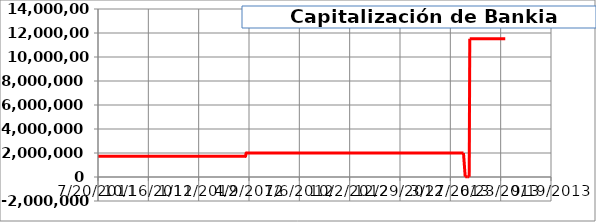
| Category | E:BKIA(UP) |
|---|---|
| 41456.0 | 11517330 |
| 41453.0 | 11517330 |
| 41452.0 | 11517330 |
| 41451.0 | 11517330 |
| 41450.0 | 11517330 |
| 41449.0 | 11517330 |
| 41446.0 | 11517330 |
| 41445.0 | 11517330 |
| 41444.0 | 11517330 |
| 41443.0 | 11517330 |
| 41442.0 | 11517330 |
| 41439.0 | 11517330 |
| 41438.0 | 11517330 |
| 41437.0 | 11517330 |
| 41436.0 | 11517330 |
| 41435.0 | 11517330 |
| 41432.0 | 11517330 |
| 41431.0 | 11517330 |
| 41430.0 | 11517330 |
| 41429.0 | 11517330 |
| 41428.0 | 11517330 |
| 41425.0 | 11517330 |
| 41424.0 | 11517330 |
| 41423.0 | 11517330 |
| 41422.0 | 11517330 |
| 41421.0 | 11517330 |
| 41418.0 | 11517330 |
| 41417.0 | 11517330 |
| 41416.0 | 11517330 |
| 41415.0 | 11517330 |
| 41414.0 | 11517330 |
| 41411.0 | 11517330 |
| 41410.0 | 11517330 |
| 41409.0 | 11517330 |
| 41408.0 | 11517330 |
| 41407.0 | 11517330 |
| 41404.0 | 11517330 |
| 41403.0 | 11517330 |
| 41402.0 | 11517330 |
| 41401.0 | 11517330 |
| 41400.0 | 11517330 |
| 41397.0 | 11517330 |
| 41396.0 | 11517330 |
| 41395.0 | 11517330 |
| 41394.0 | 11517330 |
| 41393.0 | 19940 |
| 41390.0 | 19940 |
| 41389.0 | 19940 |
| 41388.0 | 19940 |
| 41387.0 | 19940 |
| 41386.0 | 19940 |
| 41383.0 | 1993961 |
| 41382.0 | 1993961 |
| 41381.0 | 1993961 |
| 41380.0 | 1993961 |
| 41379.0 | 1993961 |
| 41376.0 | 1993961 |
| 41375.0 | 1993961 |
| 41374.0 | 1993961 |
| 41373.0 | 1993961 |
| 41372.0 | 1993961 |
| 41369.0 | 1993961 |
| 41368.0 | 1993961 |
| 41367.0 | 1993961 |
| 41366.0 | 1993961 |
| 41365.0 | 1993961 |
| 41362.0 | 1993961 |
| 41361.0 | 1993961 |
| 41360.0 | 1993961 |
| 41359.0 | 1993961 |
| 41358.0 | 1993961 |
| 41355.0 | 1993961 |
| 41354.0 | 1993961 |
| 41353.0 | 1993961 |
| 41352.0 | 1993961 |
| 41351.0 | 1993961 |
| 41348.0 | 1993961 |
| 41347.0 | 1993961 |
| 41346.0 | 1993961 |
| 41345.0 | 1993961 |
| 41344.0 | 1993961 |
| 41341.0 | 1993961 |
| 41340.0 | 1993961 |
| 41339.0 | 1993961 |
| 41338.0 | 1993961 |
| 41337.0 | 1993961 |
| 41334.0 | 1993961 |
| 41333.0 | 1993961 |
| 41332.0 | 1993961 |
| 41331.0 | 1993961 |
| 41330.0 | 1993961 |
| 41327.0 | 1993961 |
| 41326.0 | 1993961 |
| 41325.0 | 1993961 |
| 41324.0 | 1993961 |
| 41323.0 | 1993961 |
| 41320.0 | 1993961 |
| 41319.0 | 1993961 |
| 41318.0 | 1993961 |
| 41317.0 | 1993961 |
| 41316.0 | 1993961 |
| 41313.0 | 1993961 |
| 41312.0 | 1993961 |
| 41311.0 | 1993961 |
| 41310.0 | 1993961 |
| 41309.0 | 1993961 |
| 41306.0 | 1993961 |
| 41305.0 | 1993961 |
| 41304.0 | 1993961 |
| 41303.0 | 1993961 |
| 41302.0 | 1993961 |
| 41299.0 | 1993961 |
| 41298.0 | 1993961 |
| 41297.0 | 1993961 |
| 41296.0 | 1993961 |
| 41295.0 | 1993961 |
| 41292.0 | 1993961 |
| 41291.0 | 1993961 |
| 41290.0 | 1993961 |
| 41289.0 | 1993961 |
| 41288.0 | 1993961 |
| 41285.0 | 1993961 |
| 41284.0 | 1993961 |
| 41283.0 | 1993961 |
| 41282.0 | 1993961 |
| 41281.0 | 1993961 |
| 41278.0 | 1993961 |
| 41277.0 | 1993961 |
| 41276.0 | 1993961 |
| 41275.0 | 1993961 |
| 41274.0 | 1993961 |
| 41271.0 | 1993961 |
| 41270.0 | 1993961 |
| 41269.0 | 1993961 |
| 41268.0 | 1993961 |
| 41267.0 | 1993961 |
| 41264.0 | 1993961 |
| 41263.0 | 1993961 |
| 41262.0 | 1993961 |
| 41261.0 | 1993961 |
| 41260.0 | 1993961 |
| 41257.0 | 1993961 |
| 41256.0 | 1993961 |
| 41255.0 | 1993961 |
| 41254.0 | 1993961 |
| 41253.0 | 1993961 |
| 41250.0 | 1993961 |
| 41249.0 | 1993961 |
| 41248.0 | 1993961 |
| 41247.0 | 1993961 |
| 41246.0 | 1993961 |
| 41243.0 | 1993961 |
| 41242.0 | 1993961 |
| 41241.0 | 1993961 |
| 41240.0 | 1993961 |
| 41239.0 | 1993961 |
| 41236.0 | 1993961 |
| 41235.0 | 1993961 |
| 41234.0 | 1993961 |
| 41233.0 | 1993961 |
| 41232.0 | 1993961 |
| 41229.0 | 1993961 |
| 41228.0 | 1993961 |
| 41227.0 | 1993961 |
| 41226.0 | 1993961 |
| 41225.0 | 1993961 |
| 41222.0 | 1993961 |
| 41221.0 | 1993961 |
| 41220.0 | 1993961 |
| 41219.0 | 1993961 |
| 41218.0 | 1993961 |
| 41215.0 | 1993961 |
| 41214.0 | 1993961 |
| 41213.0 | 1993961 |
| 41212.0 | 1993961 |
| 41211.0 | 1993961 |
| 41208.0 | 1993961 |
| 41207.0 | 1993961 |
| 41206.0 | 1993961 |
| 41205.0 | 1993961 |
| 41204.0 | 1993961 |
| 41201.0 | 1993961 |
| 41200.0 | 1993961 |
| 41199.0 | 1993961 |
| 41198.0 | 1993961 |
| 41197.0 | 1993961 |
| 41194.0 | 1993961 |
| 41193.0 | 1993961 |
| 41192.0 | 1993961 |
| 41191.0 | 1993961 |
| 41190.0 | 1993961 |
| 41187.0 | 1993961 |
| 41186.0 | 1993961 |
| 41185.0 | 1993961 |
| 41184.0 | 1993961 |
| 41183.0 | 1993961 |
| 41180.0 | 1993961 |
| 41179.0 | 1993961 |
| 41178.0 | 1993961 |
| 41177.0 | 1993961 |
| 41176.0 | 1993961 |
| 41173.0 | 1993961 |
| 41172.0 | 1993961 |
| 41171.0 | 1993961 |
| 41170.0 | 1993961 |
| 41169.0 | 1993961 |
| 41166.0 | 1993961 |
| 41165.0 | 1993961 |
| 41164.0 | 1993961 |
| 41163.0 | 1993961 |
| 41162.0 | 1993961 |
| 41159.0 | 1993961 |
| 41158.0 | 1993961 |
| 41157.0 | 1993961 |
| 41156.0 | 1993961 |
| 41155.0 | 1993961 |
| 41152.0 | 1993961 |
| 41151.0 | 1993961 |
| 41150.0 | 1993961 |
| 41149.0 | 1993961 |
| 41148.0 | 1993961 |
| 41145.0 | 1993961 |
| 41144.0 | 1993961 |
| 41143.0 | 1993961 |
| 41142.0 | 1993961 |
| 41141.0 | 1993961 |
| 41138.0 | 1993961 |
| 41137.0 | 1993961 |
| 41136.0 | 1993961 |
| 41135.0 | 1993961 |
| 41134.0 | 1993961 |
| 41131.0 | 1993961 |
| 41130.0 | 1993961 |
| 41129.0 | 1993961 |
| 41128.0 | 1993961 |
| 41127.0 | 1993961 |
| 41124.0 | 1993961 |
| 41123.0 | 1993961 |
| 41122.0 | 1993961 |
| 41121.0 | 1993961 |
| 41120.0 | 1993961 |
| 41117.0 | 1993961 |
| 41116.0 | 1993961 |
| 41115.0 | 1993961 |
| 41114.0 | 1993961 |
| 41113.0 | 1993961 |
| 41110.0 | 1993961 |
| 41109.0 | 1993961 |
| 41108.0 | 1993961 |
| 41107.0 | 1993961 |
| 41106.0 | 1993961 |
| 41103.0 | 1993961 |
| 41102.0 | 1993961 |
| 41101.0 | 1993961 |
| 41100.0 | 1993961 |
| 41099.0 | 1993961 |
| 41096.0 | 1993961 |
| 41095.0 | 1993961 |
| 41094.0 | 1993961 |
| 41093.0 | 1993961 |
| 41092.0 | 1993961 |
| 41089.0 | 1993961 |
| 41088.0 | 1993961 |
| 41087.0 | 1993961 |
| 41086.0 | 1993961 |
| 41085.0 | 1993961 |
| 41082.0 | 1993961 |
| 41081.0 | 1993961 |
| 41080.0 | 1993961 |
| 41079.0 | 1993961 |
| 41078.0 | 1993961 |
| 41075.0 | 1993961 |
| 41074.0 | 1993961 |
| 41073.0 | 1993961 |
| 41072.0 | 1993961 |
| 41071.0 | 1993961 |
| 41068.0 | 1993961 |
| 41067.0 | 1993961 |
| 41066.0 | 1993961 |
| 41065.0 | 1993961 |
| 41064.0 | 1993961 |
| 41061.0 | 1993961 |
| 41060.0 | 1993961 |
| 41059.0 | 1993961 |
| 41058.0 | 1993961 |
| 41057.0 | 1993961 |
| 41054.0 | 1993961 |
| 41053.0 | 1993961 |
| 41052.0 | 1993961 |
| 41051.0 | 1993961 |
| 41050.0 | 1993961 |
| 41047.0 | 1993961 |
| 41046.0 | 1993961 |
| 41045.0 | 1993961 |
| 41044.0 | 1993961 |
| 41043.0 | 1993961 |
| 41040.0 | 1993961 |
| 41039.0 | 1993961 |
| 41038.0 | 1993961 |
| 41037.0 | 1993961 |
| 41036.0 | 1993961 |
| 41033.0 | 1993961 |
| 41032.0 | 1993961 |
| 41031.0 | 1993961 |
| 41030.0 | 1993961 |
| 41029.0 | 1993961 |
| 41026.0 | 1993961 |
| 41025.0 | 1993961 |
| 41024.0 | 1993961 |
| 41023.0 | 1993961 |
| 41022.0 | 1993961 |
| 41019.0 | 1993961 |
| 41018.0 | 1993961 |
| 41017.0 | 1993961 |
| 41016.0 | 1993961 |
| 41015.0 | 1993961 |
| 41012.0 | 1993961 |
| 41011.0 | 1993961 |
| 41010.0 | 1993961 |
| 41009.0 | 1993961 |
| 41008.0 | 1993961 |
| 41005.0 | 1993961 |
| 41004.0 | 1993961 |
| 41003.0 | 1993961 |
| 41002.0 | 1732672 |
| 41001.0 | 1732672 |
| 40998.0 | 1732672 |
| 40997.0 | 1732672 |
| 40996.0 | 1732672 |
| 40995.0 | 1732672 |
| 40994.0 | 1732672 |
| 40991.0 | 1732672 |
| 40990.0 | 1732672 |
| 40989.0 | 1732672 |
| 40988.0 | 1732672 |
| 40987.0 | 1732672 |
| 40984.0 | 1732672 |
| 40983.0 | 1732672 |
| 40982.0 | 1732672 |
| 40981.0 | 1732672 |
| 40980.0 | 1732672 |
| 40977.0 | 1732672 |
| 40976.0 | 1732672 |
| 40975.0 | 1732672 |
| 40974.0 | 1732672 |
| 40973.0 | 1732672 |
| 40970.0 | 1732672 |
| 40969.0 | 1732672 |
| 40968.0 | 1732672 |
| 40967.0 | 1732672 |
| 40966.0 | 1732672 |
| 40963.0 | 1732672 |
| 40962.0 | 1732672 |
| 40961.0 | 1732672 |
| 40960.0 | 1732672 |
| 40959.0 | 1732672 |
| 40956.0 | 1732672 |
| 40955.0 | 1732672 |
| 40954.0 | 1732672 |
| 40953.0 | 1732672 |
| 40952.0 | 1732672 |
| 40949.0 | 1732672 |
| 40948.0 | 1732672 |
| 40947.0 | 1732672 |
| 40946.0 | 1732672 |
| 40945.0 | 1732672 |
| 40942.0 | 1732672 |
| 40941.0 | 1732672 |
| 40940.0 | 1732672 |
| 40939.0 | 1732672 |
| 40938.0 | 1732672 |
| 40935.0 | 1732672 |
| 40934.0 | 1732672 |
| 40933.0 | 1732672 |
| 40932.0 | 1732672 |
| 40931.0 | 1732672 |
| 40928.0 | 1732672 |
| 40927.0 | 1732672 |
| 40926.0 | 1732672 |
| 40925.0 | 1732672 |
| 40924.0 | 1732672 |
| 40921.0 | 1732672 |
| 40920.0 | 1732672 |
| 40919.0 | 1732672 |
| 40918.0 | 1732672 |
| 40917.0 | 1732672 |
| 40914.0 | 1732672 |
| 40913.0 | 1732672 |
| 40912.0 | 1732672 |
| 40911.0 | 1732672 |
| 40910.0 | 1732672 |
| 40907.0 | 1732572 |
| 40906.0 | 1732572 |
| 40905.0 | 1732572 |
| 40904.0 | 1732572 |
| 40903.0 | 1732572 |
| 40900.0 | 1732572 |
| 40899.0 | 1732572 |
| 40898.0 | 1732572 |
| 40897.0 | 1732572 |
| 40896.0 | 1732572 |
| 40893.0 | 1732572 |
| 40892.0 | 1732572 |
| 40891.0 | 1732572 |
| 40890.0 | 1732572 |
| 40889.0 | 1732572 |
| 40886.0 | 1732572 |
| 40885.0 | 1732572 |
| 40884.0 | 1732572 |
| 40883.0 | 1732572 |
| 40882.0 | 1732572 |
| 40879.0 | 1732572 |
| 40878.0 | 1732572 |
| 40877.0 | 1732572 |
| 40876.0 | 1732572 |
| 40875.0 | 1732572 |
| 40872.0 | 1732572 |
| 40871.0 | 1732572 |
| 40870.0 | 1732572 |
| 40869.0 | 1732572 |
| 40868.0 | 1732572 |
| 40865.0 | 1732572 |
| 40864.0 | 1732572 |
| 40863.0 | 1732572 |
| 40862.0 | 1732572 |
| 40861.0 | 1732572 |
| 40858.0 | 1732572 |
| 40857.0 | 1732572 |
| 40856.0 | 1732572 |
| 40855.0 | 1732572 |
| 40854.0 | 1732572 |
| 40851.0 | 1732572 |
| 40850.0 | 1732572 |
| 40849.0 | 1732572 |
| 40848.0 | 1732572 |
| 40847.0 | 1732572 |
| 40844.0 | 1732572 |
| 40843.0 | 1732572 |
| 40842.0 | 1732572 |
| 40841.0 | 1732572 |
| 40840.0 | 1732572 |
| 40837.0 | 1732572 |
| 40836.0 | 1732572 |
| 40835.0 | 1732572 |
| 40834.0 | 1732572 |
| 40833.0 | 1732572 |
| 40830.0 | 1732572 |
| 40829.0 | 1732572 |
| 40828.0 | 1732572 |
| 40827.0 | 1732572 |
| 40826.0 | 1732572 |
| 40823.0 | 1732572 |
| 40822.0 | 1732572 |
| 40821.0 | 1732572 |
| 40820.0 | 1732572 |
| 40819.0 | 1732572 |
| 40816.0 | 1732572 |
| 40815.0 | 1732572 |
| 40814.0 | 1732572 |
| 40813.0 | 1732572 |
| 40812.0 | 1732572 |
| 40809.0 | 1732572 |
| 40808.0 | 1732572 |
| 40807.0 | 1732572 |
| 40806.0 | 1732572 |
| 40805.0 | 1732572 |
| 40802.0 | 1732572 |
| 40801.0 | 1732572 |
| 40800.0 | 1732572 |
| 40799.0 | 1732572 |
| 40798.0 | 1732572 |
| 40795.0 | 1732572 |
| 40794.0 | 1732572 |
| 40793.0 | 1732572 |
| 40792.0 | 1732572 |
| 40791.0 | 1732572 |
| 40788.0 | 1732572 |
| 40787.0 | 1732572 |
| 40786.0 | 1732572 |
| 40785.0 | 1732572 |
| 40784.0 | 1732572 |
| 40781.0 | 1732572 |
| 40780.0 | 1732572 |
| 40779.0 | 1732572 |
| 40778.0 | 1732572 |
| 40777.0 | 1732572 |
| 40774.0 | 1732572 |
| 40773.0 | 1732572 |
| 40772.0 | 1732572 |
| 40771.0 | 1732572 |
| 40770.0 | 1732572 |
| 40767.0 | 1732572 |
| 40766.0 | 1732572 |
| 40765.0 | 1732572 |
| 40764.0 | 1732572 |
| 40763.0 | 1732572 |
| 40760.0 | 1732572 |
| 40759.0 | 1732572 |
| 40758.0 | 1732572 |
| 40757.0 | 1732572 |
| 40756.0 | 1732572 |
| 40753.0 | 1732572 |
| 40752.0 | 1732572 |
| 40751.0 | 1732572 |
| 40750.0 | 1732572 |
| 40749.0 | 1732572 |
| 40746.0 | 1732572 |
| 40745.0 | 1732572 |
| 40744.0 | 1732572 |